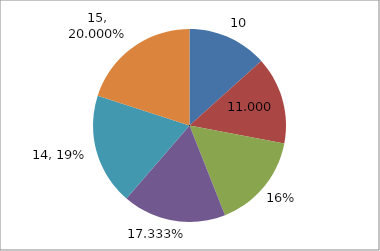
| Category | Series 1 |
|---|---|
| Point 1 | 10 |
| Point 2 | 11 |
| Point 3 | 12 |
| Point 4 | 13 |
| Point 5 | 14 |
| Point 6 | 15 |